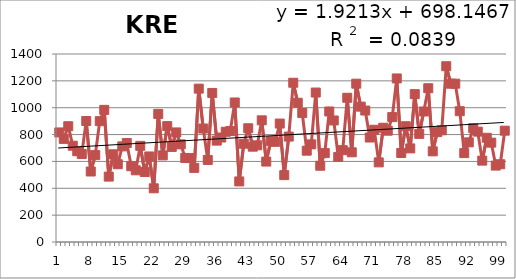
| Category | 1913-2012 |
|---|---|
| 0 | 816 |
| 1 | 768 |
| 2 | 862 |
| 3 | 717 |
| 4 | 676 |
| 5 | 655 |
| 6 | 901 |
| 7 | 525 |
| 8 | 647 |
| 9 | 900 |
| 10 | 984 |
| 11 | 487 |
| 12 | 653 |
| 13 | 579 |
| 14 | 712 |
| 15 | 737 |
| 16 | 564 |
| 17 | 534 |
| 18 | 716 |
| 19 | 521 |
| 20 | 637 |
| 21 | 400 |
| 22 | 954 |
| 23 | 645 |
| 24 | 863 |
| 25 | 708 |
| 26 | 816 |
| 27 | 727 |
| 28 | 626 |
| 29 | 625 |
| 30 | 552 |
| 31 | 1142 |
| 32 | 845 |
| 33 | 611 |
| 34 | 1110 |
| 35 | 755 |
| 36 | 778 |
| 37 | 821 |
| 38 | 826 |
| 39 | 1039 |
| 40 | 451 |
| 41 | 732 |
| 42 | 847 |
| 43 | 710 |
| 44 | 720 |
| 45 | 906 |
| 46 | 599 |
| 47 | 751 |
| 48 | 746 |
| 49 | 882 |
| 50 | 498 |
| 51 | 785 |
| 52 | 1186 |
| 53 | 1037 |
| 54 | 961 |
| 55 | 680 |
| 56 | 727 |
| 57 | 1113 |
| 58 | 568 |
| 59 | 662 |
| 60 | 972 |
| 61 | 905 |
| 62 | 634 |
| 63 | 684 |
| 64 | 1074 |
| 65 | 668 |
| 66 | 1179 |
| 67 | 1008 |
| 68 | 979 |
| 69 | 778 |
| 70 | 836 |
| 71 | 593 |
| 72 | 851 |
| 73 | 829 |
| 74 | 930 |
| 75 | 1218 |
| 76 | 663 |
| 77 | 862 |
| 78 | 697 |
| 79 | 1101 |
| 80 | 805 |
| 81 | 972 |
| 82 | 1145 |
| 83 | 675 |
| 84 | 818 |
| 85 | 832 |
| 86 | 1309 |
| 87 | 1179 |
| 88 | 1179 |
| 89 | 974 |
| 90 | 662 |
| 91 | 742 |
| 92 | 848 |
| 93 | 822 |
| 94 | 606 |
| 95 | 776 |
| 96 | 740 |
| 97 | 569 |
| 98 | 579 |
| 99 | 829 |